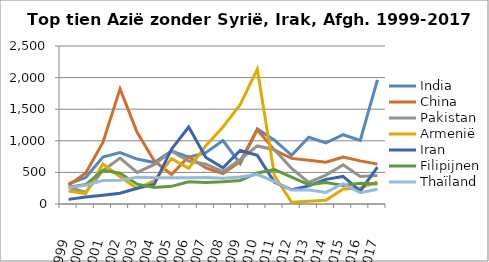
| Category | India | China | Pakistan | Armenië | Iran | Filipijnen | Thaïland |
|---|---|---|---|---|---|---|---|
| 1999.0 | 319 | 298 | 261 | 204 | 73 | 267 | 259 |
| 2000.0 | 420 | 490 | 188 | 166 | 112 | 308 | 296 |
| 2001.0 | 743 | 975 | 528 | 632 | 139 | 532 | 370 |
| 2002.0 | 813 | 1822 | 727 | 432 | 170 | 486 | 377 |
| 2003.0 | 711 | 1129 | 500 | 244 | 250 | 314 | 425 |
| 2004.0 | 656 | 681 | 626 | 372 | 312 | 261 | 415 |
| 2005.0 | 841 | 468 | 834 | 718 | 867 | 279 | 415 |
| 2006.0 | 742 | 749 | 679 | 566 | 1218 | 353 | 416 |
| 2007.0 | 813 | 570 | 629 | 921 | 737 | 340 | 419 |
| 2008.0 | 1004 | 482 | 512 | 1218 | 573 | 352 | 406 |
| 2009.0 | 639 | 674 | 705 | 1572 | 846 | 373 | 426 |
| 2010.0 | 1188 | 1176 | 919 | 2134 | 769 | 492 | 468 |
| 2011.0 | 1009 | 853 | 859 | 449 | 342 | 543 | 353 |
| 2012.0 | 771 | 722 | 562 | 28 | 227 | 425 | 221 |
| 2013.0 | 1055 | 691 | 341 | 42 | 287 | 305 | 223 |
| 2014.0 | 966 | 661 | 458 | 59 | 390 | 341 | 183 |
| 2015.0 | 1096 | 742 | 619 | 237 | 436 | 292 | 323 |
| 2016.0 | 1006 | 682 | 435 | 253 | 204 | 330 | 178 |
| 2017.0 | 1965 | 631 | 450 | 349 | 585 | 318 | 234 |